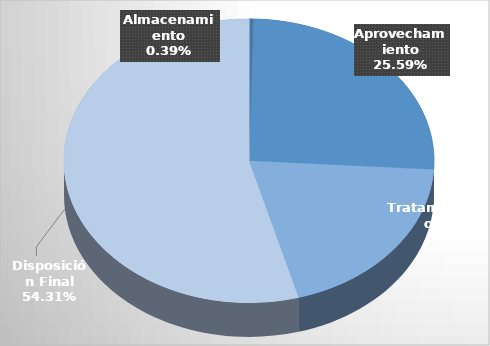
| Category | Almacenamiento |
|---|---|
| Almacenamiento | 72857.64 |
| Aprovechamiento | 4835930.96 |
| Tratamiento | 3725363.05 |
| Disposición Final | 10263046.05 |